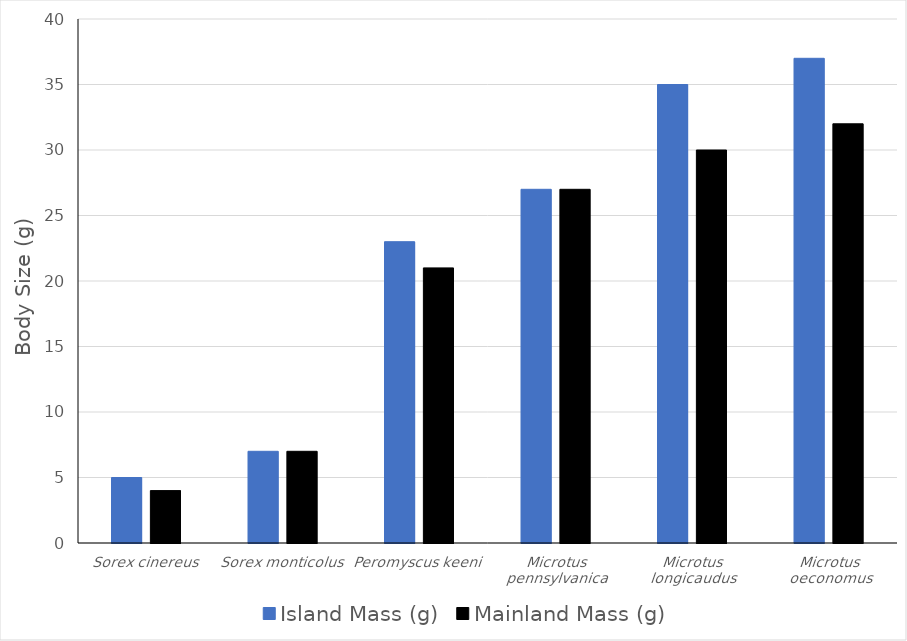
| Category | Island Mass (g) | Mainland Mass (g) |
|---|---|---|
| Sorex cinereus | 5 | 4 |
| Sorex monticolus | 7 | 7 |
| Peromyscus keeni | 23 | 21 |
| Microtus pennsylvanica | 27 | 27 |
| Microtus longicaudus | 35 | 30 |
| Microtus oeconomus | 37 | 32 |